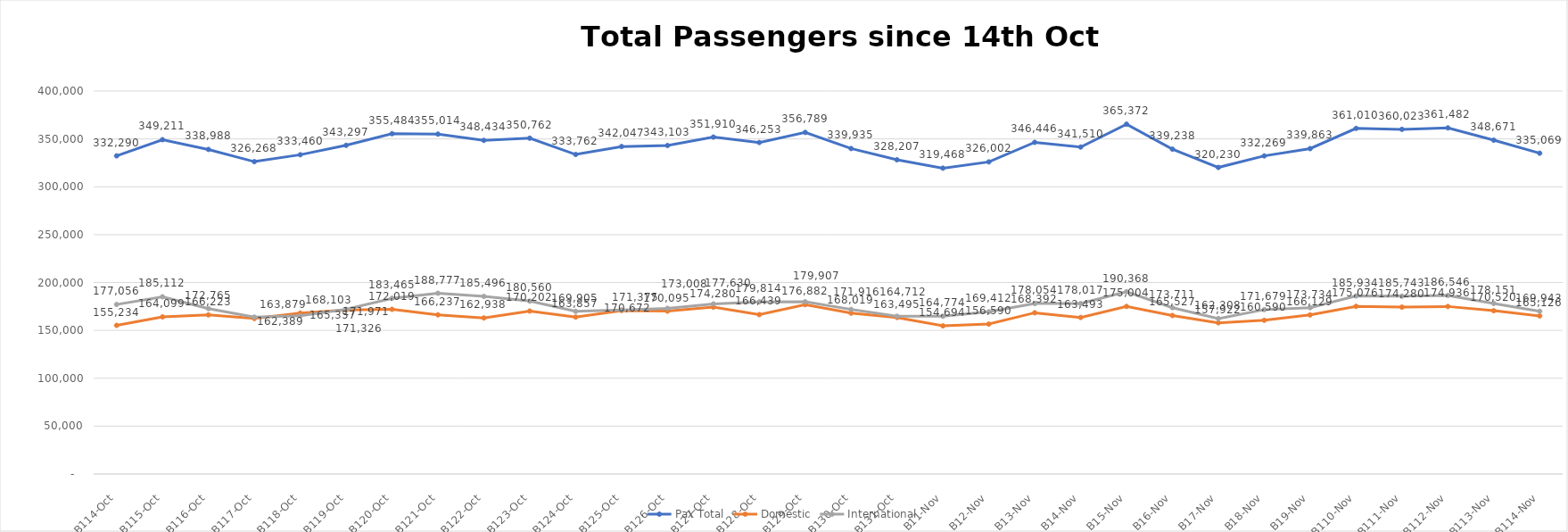
| Category | Pax Total | Domestic | International |
|---|---|---|---|
| 2023-10-14 | 332290 | 155234 | 177056 |
| 2023-10-15 | 349211 | 164099 | 185112 |
| 2023-10-16 | 338988 | 166223 | 172765 |
| 2023-10-17 | 326268 | 162389 | 163879 |
| 2023-10-18 | 333460 | 168103 | 165357 |
| 2023-10-19 | 343297 | 171326 | 171971 |
| 2023-10-20 | 355484 | 172019 | 183465 |
| 2023-10-21 | 355014 | 166237 | 188777 |
| 2023-10-22 | 348434 | 162938 | 185496 |
| 2023-10-23 | 350762 | 170202 | 180560 |
| 2023-10-24 | 333762 | 163857 | 169905 |
| 2023-10-25 | 342047 | 170672 | 171375 |
| 2023-10-26 | 343103 | 170095 | 173008 |
| 2023-10-27 | 351910 | 174280 | 177630 |
| 2023-10-28 | 346253 | 166439 | 179814 |
| 2023-10-29 | 356789 | 176882 | 179907 |
| 2023-10-30 | 339935 | 168019 | 171916 |
| 2023-10-31 | 328207 | 163495 | 164712 |
| 2023-11-01 | 319468 | 154694 | 164774 |
| 2023-11-02 | 326002 | 156590 | 169412 |
| 2023-11-03 | 346446 | 168392 | 178054 |
| 2023-11-04 | 341510 | 163493 | 178017 |
| 2023-11-05 | 365372 | 175004 | 190368 |
| 2023-11-06 | 339238 | 165527 | 173711 |
| 2023-11-07 | 320230 | 157922 | 162308 |
| 2023-11-08 | 332269 | 160590 | 171679 |
| 2023-11-09 | 339863 | 166129 | 173734 |
| 2023-11-10 | 361010 | 175076 | 185934 |
| 2023-11-11 | 360023 | 174280 | 185743 |
| 2023-11-12 | 361482 | 174936 | 186546 |
| 2023-11-13 | 348671 | 170520 | 178151 |
| 2023-11-14 | 335069 | 165126 | 169943 |